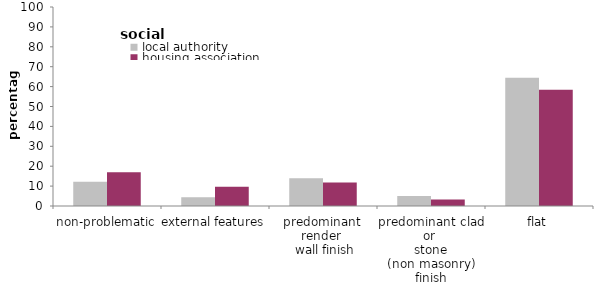
| Category | local authority | housing association |
|---|---|---|
| non-problematic | 12.124 | 16.961 |
| external features | 4.456 | 9.635 |
| predominant 
render 
 wall finish | 13.903 | 11.775 |
| predominant clad or 
stone
(non masonry) finish | 5.031 | 3.257 |
| flat | 64.487 | 58.372 |